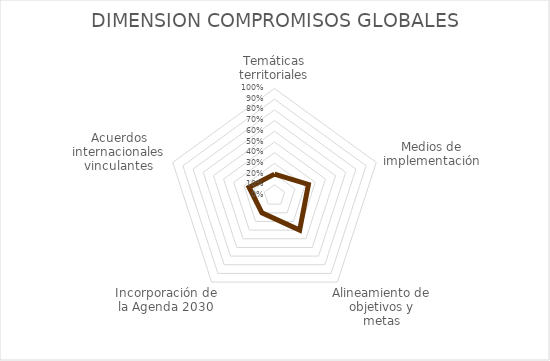
| Category | Series 0 |
|---|---|
| Temáticas territoriales | 0.2 |
| Medios de implementación | 0.333 |
| Alineamiento de objetivos y metas | 0.4 |
| Incorporación de la Agenda 2030 | 0.2 |
| Acuerdos internacionales vinculantes | 0.25 |